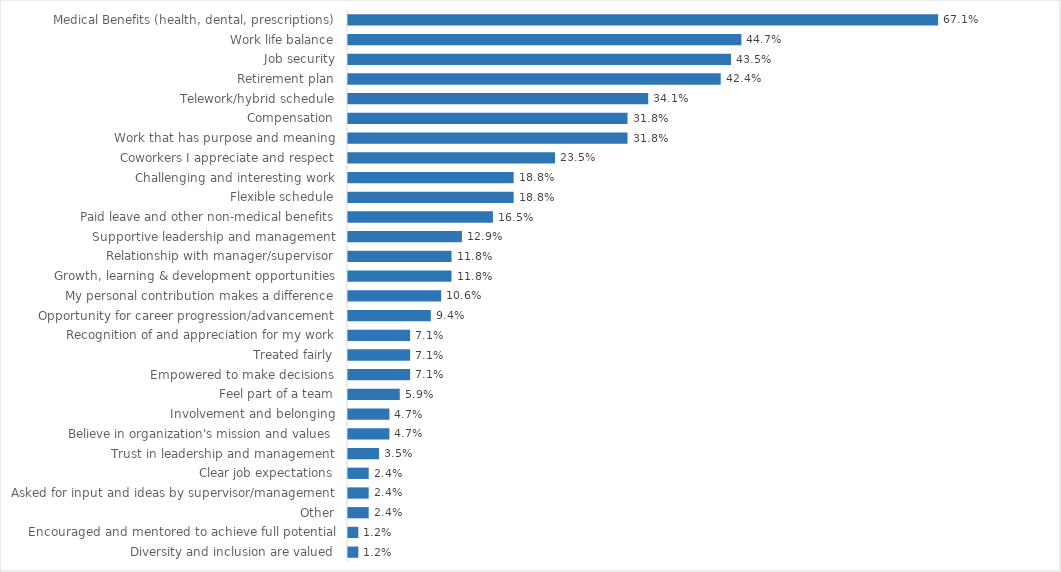
| Category | Series 0 |
|---|---|
| Medical Benefits (health, dental, prescriptions) | 0.671 |
| Work life balance | 0.447 |
| Job security | 0.435 |
| Retirement plan | 0.424 |
| Telework/hybrid schedule | 0.341 |
| Compensation | 0.318 |
| Work that has purpose and meaning | 0.318 |
| Coworkers I appreciate and respect | 0.235 |
| Challenging and interesting work | 0.188 |
| Flexible schedule | 0.188 |
| Paid leave and other non-medical benefits | 0.165 |
| Supportive leadership and management | 0.129 |
| Relationship with manager/supervisor | 0.118 |
| Growth, learning & development opportunities | 0.118 |
| My personal contribution makes a difference | 0.106 |
| Opportunity for career progression/advancement | 0.094 |
| Recognition of and appreciation for my work | 0.071 |
| Treated fairly | 0.071 |
| Empowered to make decisions | 0.071 |
| Feel part of a team | 0.059 |
| Involvement and belonging | 0.047 |
| Believe in organization's mission and values | 0.047 |
| Trust in leadership and management | 0.035 |
| Clear job expectations | 0.024 |
| Asked for input and ideas by supervisor/management | 0.024 |
| Other | 0.024 |
| Encouraged and mentored to achieve full potential | 0.012 |
| Diversity and inclusion are valued | 0.012 |